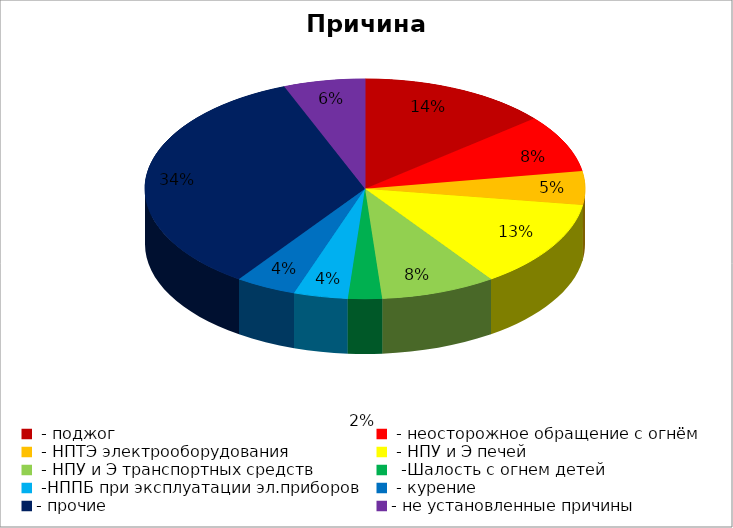
| Category | Причина пожара |
|---|---|
|  - поджог | 28 |
|  - неосторожное обращение с огнём | 17 |
|  - НПТЭ электрооборудования | 10 |
|  - НПУ и Э печей | 26 |
|  - НПУ и Э транспортных средств | 17 |
|   -Шалость с огнем детей | 5 |
|  -НППБ при эксплуатации эл.приборов | 8 |
|  - курение | 9 |
| - прочие | 69 |
| - не установленные причины | 12 |